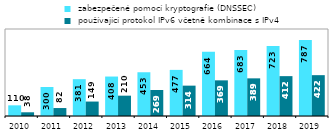
| Category |  zabezpečené pomocí kryptografie (DNSSEC) |  používající protokol IPv6 včetně kombinace s IPv4 |
|---|---|---|
| 2010.0 | 110.356 | 38.453 |
| 2011.0 | 300.041 | 82.332 |
| 2012.0 | 380.902 | 149.447 |
| 2013.0 | 408.238 | 210.265 |
| 2014.0 | 452.54 | 268.969 |
| 2015.0 | 477.037 | 314.007 |
| 2016.0 | 663.92 | 368.832 |
| 2017.0 | 683.342 | 389.459 |
| 2018.0 | 723.248 | 412.367 |
| 2019.0 | 787.187 | 422.456 |